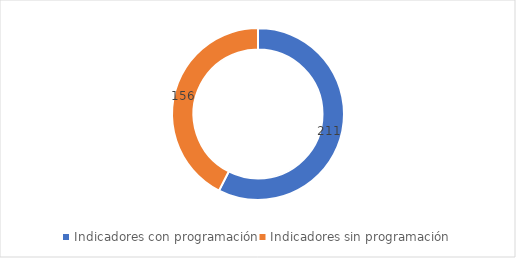
| Category | Series 0 |
|---|---|
| Indicadores con programación | 211 |
| Indicadores sin programación | 156 |